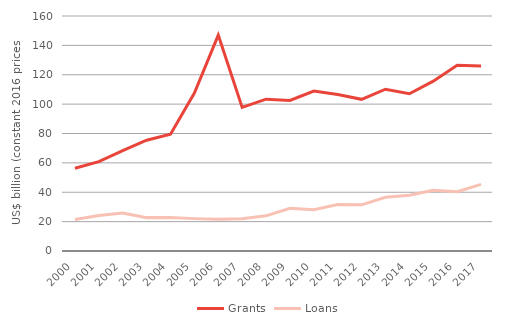
| Category | Grants | Loans |
|---|---|---|
| 2000 | 56322 | 21449.42 |
| 2001 | 60841.69 | 24169.85 |
| 2002 | 68302.57 | 25837.73 |
| 2003 | 75419.16 | 22723.49 |
| 2004 | 79497.29 | 22736.57 |
| 2005 | 107494.97 | 22042.5 |
| 2006 | 146963.77 | 21655.22 |
| 2007 | 97733.22 | 21996.99 |
| 2008 | 103356.56 | 23957.45 |
| 2009 | 102542.21 | 29084 |
| 2010 | 108942.23 | 28096.84 |
| 2011 | 106516.54 | 31706.34 |
| 2012 | 103258.44 | 31420.45 |
| 2013 | 110144.73 | 36595.09 |
| 2014 | 107047.35 | 37938.96 |
| 2015 | 115635.98 | 41314.85 |
| 2016 | 126484.9 | 40419.37 |
| 2017 | 125983.91 | 45367.06 |